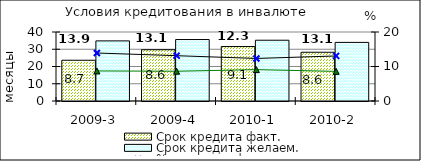
| Category | Срок кредита факт.  | Срок кредита желаем. |
|---|---|---|
| 2009-3 | 23.63 | 34.85 |
| 2009-4 | 29.73 | 35.63 |
| 2010-1 | 31.57 | 35.23 |
| 2010-2 | 28.26 | 33.97 |